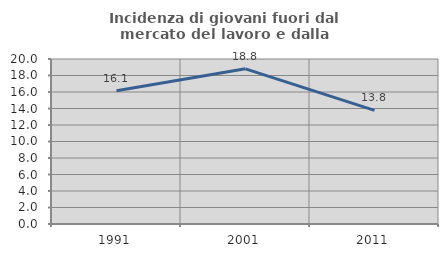
| Category | Incidenza di giovani fuori dal mercato del lavoro e dalla formazione  |
|---|---|
| 1991.0 | 16.149 |
| 2001.0 | 18.809 |
| 2011.0 | 13.77 |